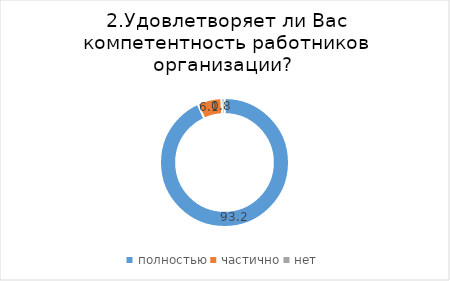
| Category | Series 0 |
|---|---|
| полностью | 93.182 |
| частично | 6.061 |
| нет | 0.758 |